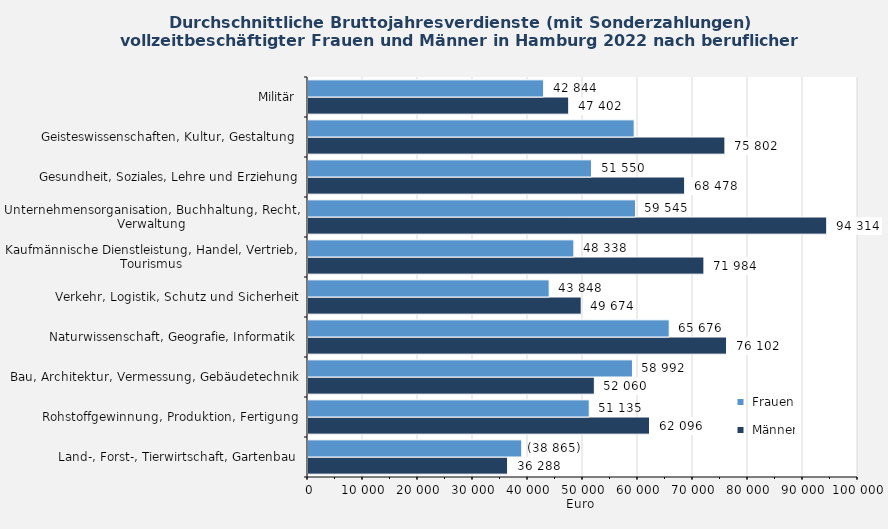
| Category |  Männer |  Frauen |
|---|---|---|
| Land-, Forst-, Tierwirtschaft, Gartenbau | 36288 | 38865 |
| Rohstoffgewinnung, Produktion, Fertigung | 62096 | 51135 |
| Bau, Architektur, Vermessung, Gebäudetechnik | 52060 | 58992 |
| Naturwissenschaft, Geografie, Informatik | 76102 | 65676 |
| Verkehr, Logistik, Schutz und Sicherheit | 49674 | 43848 |
| Kaufmännische Dienstleistung, Handel, Vertrieb, Tourismus | 71984 | 48338 |
| Unternehmensorganisation, Buchhaltung, Recht, Verwaltung | 94314 | 59545 |
| Gesundheit, Soziales, Lehre und Erziehung | 68478 | 51550 |
| Geisteswissenschaften, Kultur, Gestaltung | 75802 | 59306 |
| Militär | 47402 | 42844 |